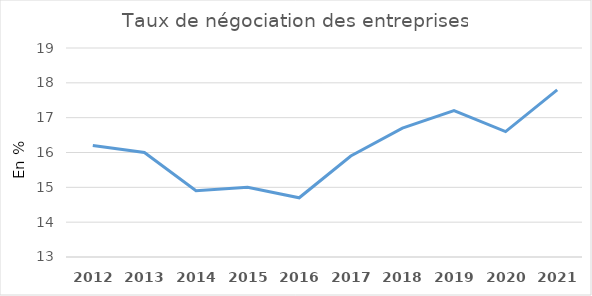
| Category | Taux de négociation des entreprises |
|---|---|
| 2012.0 | 16.2 |
| 2013.0 | 16 |
| 2014.0 | 14.9 |
| 2015.0 | 15 |
| 2016.0 | 14.7 |
| 2017.0 | 15.9 |
| 2018.0 | 16.7 |
| 2019.0 | 17.2 |
| 2020.0 | 16.6 |
| 2021.0 | 17.8 |